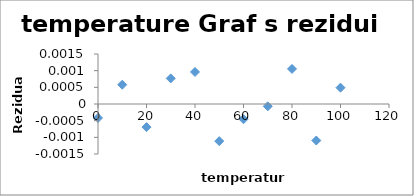
| Category | Series 0 |
|---|---|
| 0.0 | 0 |
| 10.0 | 0.001 |
| 20.0 | -0.001 |
| 30.0 | 0.001 |
| 40.0 | 0.001 |
| 50.0 | -0.001 |
| 60.0 | 0 |
| 70.0 | 0 |
| 80.0 | 0.001 |
| 90.0 | -0.001 |
| 100.0 | 0 |